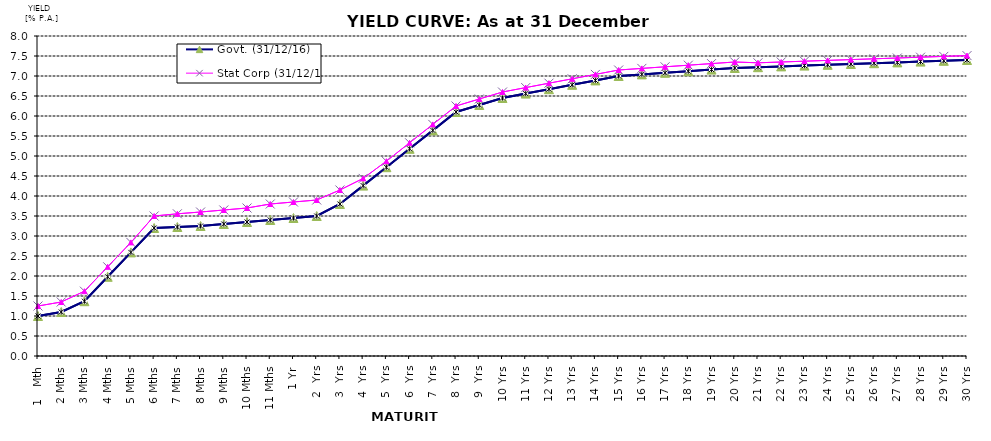
| Category | Govt. (31/12/16) | Stat Corp (31/12/16) |
|---|---|---|
| 1   Mth | 1 | 1.25 |
| 2 Mths | 1.1 | 1.35 |
| 3 Mths | 1.37 | 1.62 |
| 4 Mths | 1.98 | 2.23 |
| 5 Mths | 2.59 | 2.84 |
| 6 Mths | 3.2 | 3.5 |
| 7 Mths | 3.225 | 3.555 |
| 8 Mths | 3.25 | 3.6 |
| 9 Mths | 3.3 | 3.65 |
| 10 Mths | 3.35 | 3.7 |
| 11 Mths | 3.4 | 3.8 |
| 1 Yr | 3.45 | 3.85 |
| 2  Yrs | 3.5 | 3.9 |
| 3  Yrs | 3.8 | 4.15 |
| 4  Yrs | 4.26 | 4.44 |
| 5  Yrs | 4.72 | 4.87 |
| 6  Yrs | 5.18 | 5.33 |
| 7  Yrs | 5.64 | 5.79 |
| 8  Yrs | 6.1 | 6.25 |
| 9  Yrs | 6.275 | 6.425 |
| 10 Yrs | 6.45 | 6.6 |
| 11 Yrs | 6.56 | 6.71 |
| 12 Yrs | 6.67 | 6.82 |
| 13 Yrs | 6.78 | 6.93 |
| 14 Yrs | 6.89 | 7.04 |
| 15 Yrs | 7 | 7.15 |
| 16 Yrs | 7.04 | 7.19 |
| 17 Yrs | 7.08 | 7.23 |
| 18 Yrs | 7.12 | 7.27 |
| 19 Yrs | 7.16 | 7.31 |
| 20 Yrs | 7.2 | 7.35 |
| 21 Yrs | 7.22 | 7.33 |
| 22 Yrs | 7.24 | 7.35 |
| 23 Yrs | 7.26 | 7.37 |
| 24 Yrs | 7.28 | 7.39 |
| 25 Yrs | 7.3 | 7.41 |
| 26 Yrs | 7.32 | 7.43 |
| 27 Yrs | 7.34 | 7.45 |
| 28 Yrs | 7.36 | 7.47 |
| 29 Yrs | 7.38 | 7.49 |
| 30 Yrs | 7.4 | 7.51 |